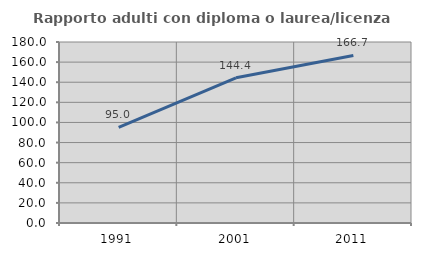
| Category | Rapporto adulti con diploma o laurea/licenza media  |
|---|---|
| 1991.0 | 95.03 |
| 2001.0 | 144.424 |
| 2011.0 | 166.667 |